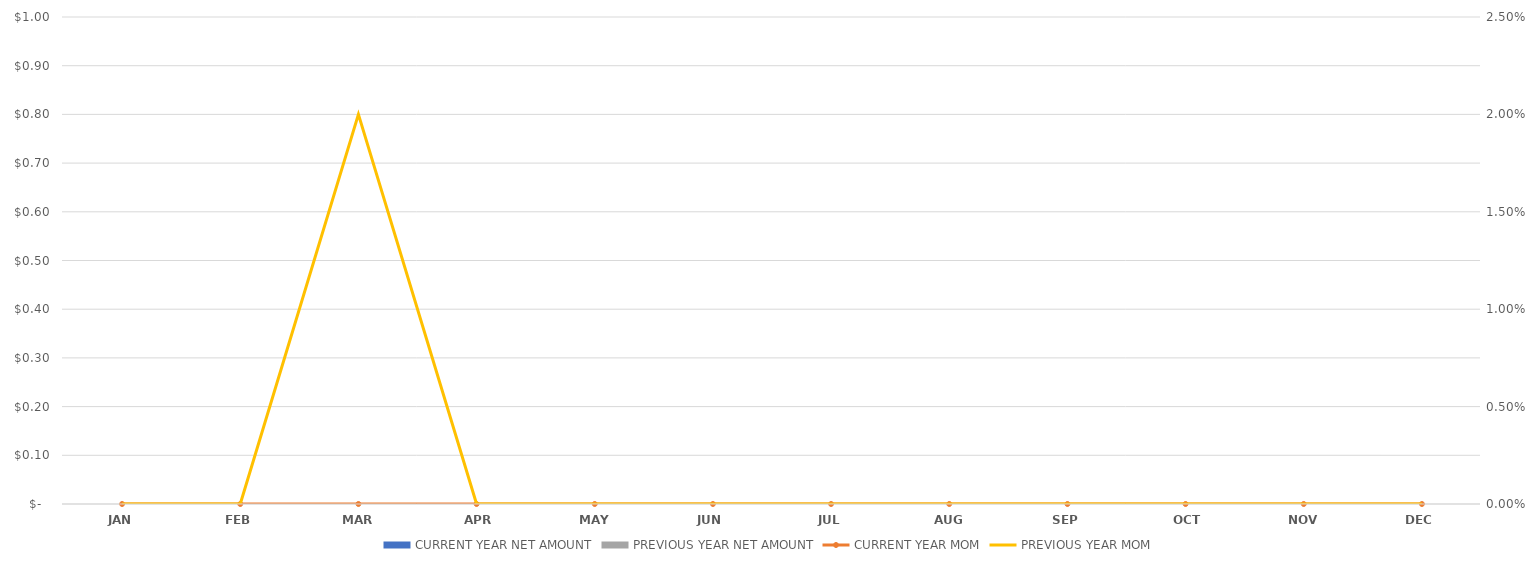
| Category | CURRENT YEAR NET AMOUNT | PREVIOUS YEAR NET AMOUNT |
|---|---|---|
| JAN | 0 | 0 |
| FEB | 0 | 0 |
| MAR | 0 | 0 |
| APR | 0 | 0 |
| MAY | 0 | 0 |
| JUN | 0 | 0 |
| JUL | 0 | 0 |
| AUG | 0 | 0 |
| SEP | 0 | 0 |
| OCT | 0 | 0 |
| NOV | 0 | 0 |
| DEC | 0 | 0 |